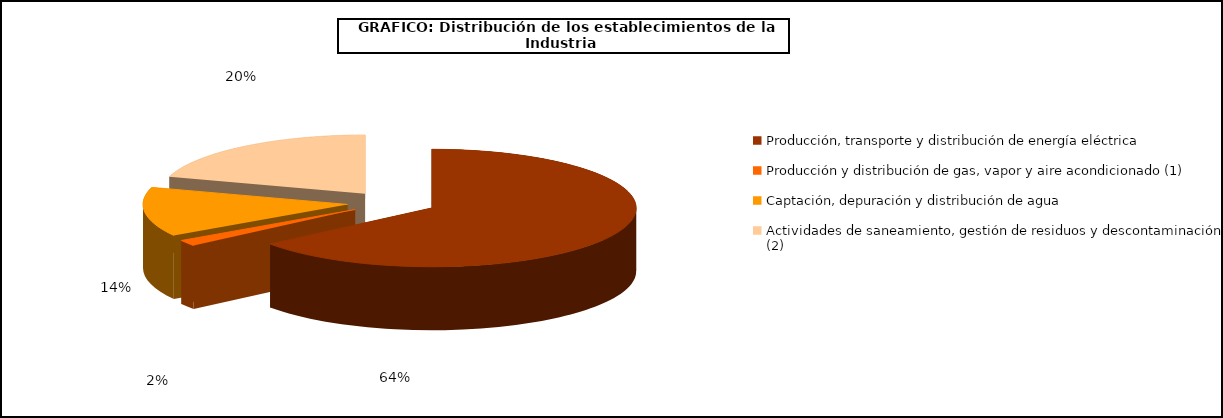
| Category | Series 0 |
|---|---|
| Producción, transporte y distribución de energía eléctrica | 17185 |
| Producción y distribución de gas, vapor y aire acondicionado (1) | 443 |
| Captación, depuración y distribución de agua | 3608 |
| Actividades de saneamiento, gestión de residuos y descontaminación (2) | 5412 |